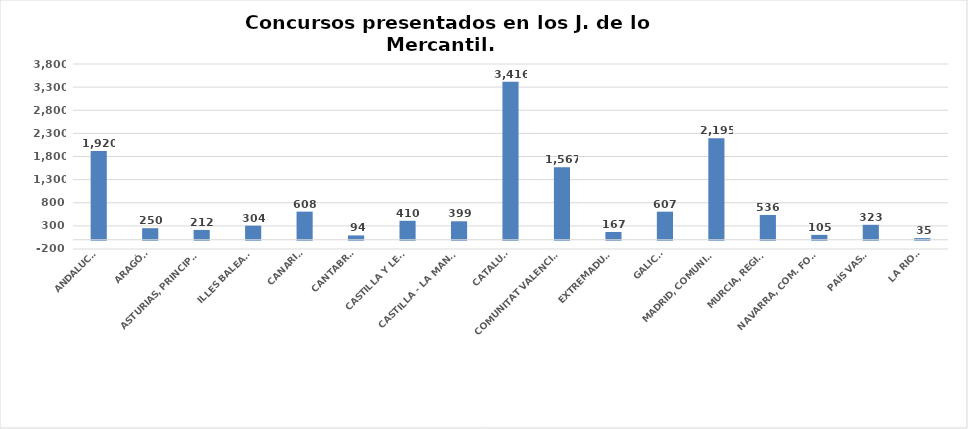
| Category | Series 0 |
|---|---|
| ANDALUCÍA | 1920 |
| ARAGÓN | 250 |
| ASTURIAS, PRINCIPADO | 212 |
| ILLES BALEARS | 304 |
| CANARIAS | 608 |
| CANTABRIA | 94 |
| CASTILLA Y LEÓN | 410 |
| CASTILLA - LA MANCHA | 399 |
| CATALUÑA | 3416 |
| COMUNITAT VALENCIANA | 1567 |
| EXTREMADURA | 167 |
| GALICIA | 607 |
| MADRID, COMUNIDAD | 2195 |
| MURCIA, REGIÓN | 536 |
| NAVARRA, COM. FORAL | 105 |
| PAÍS VASCO | 323 |
| LA RIOJA | 35 |